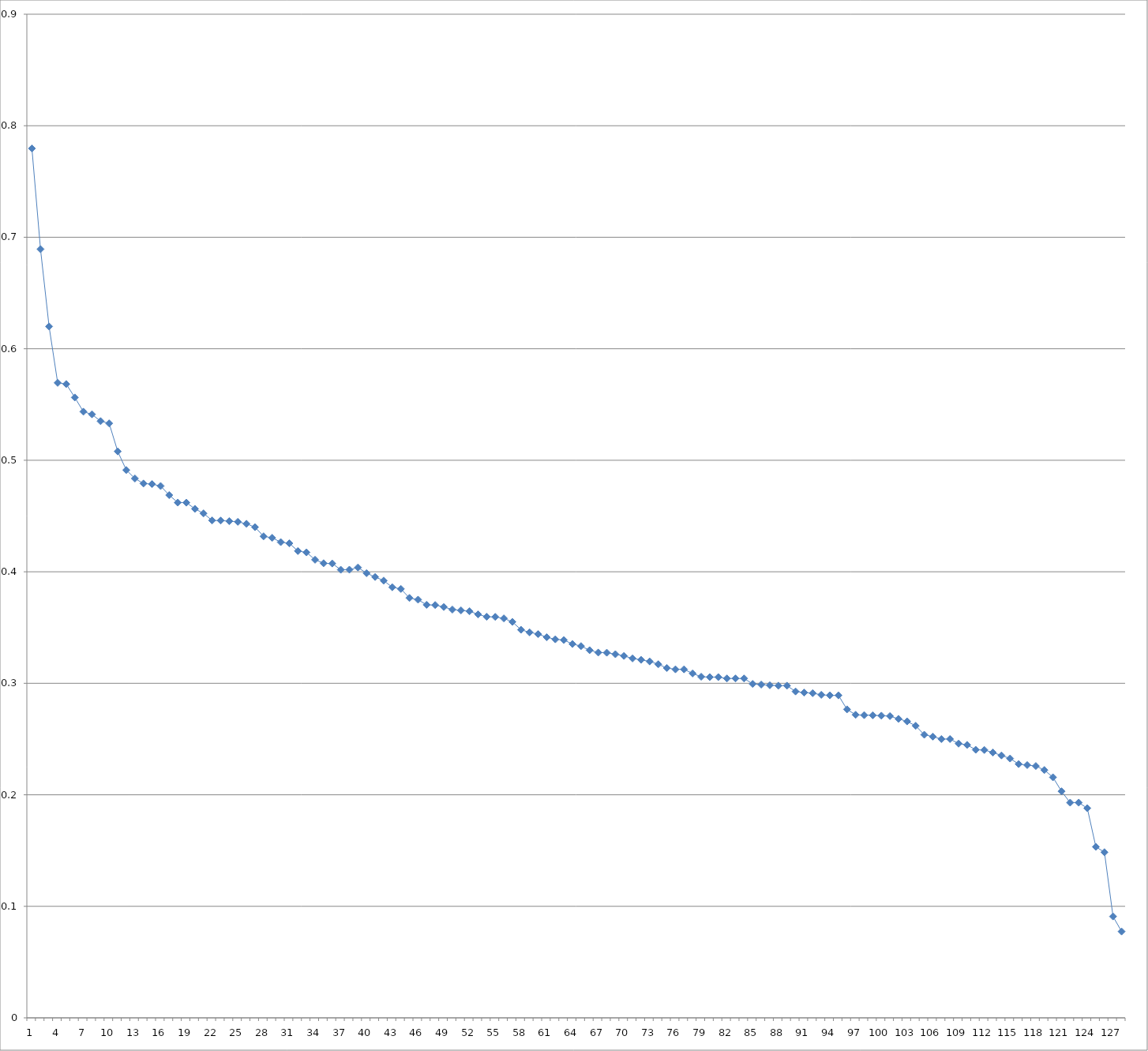
| Category | Series 0 |
|---|---|
| 0 | 0.78 |
| 1 | 0.689 |
| 2 | 0.62 |
| 3 | 0.569 |
| 4 | 0.568 |
| 5 | 0.556 |
| 6 | 0.544 |
| 7 | 0.541 |
| 8 | 0.535 |
| 9 | 0.533 |
| 10 | 0.508 |
| 11 | 0.491 |
| 12 | 0.484 |
| 13 | 0.479 |
| 14 | 0.479 |
| 15 | 0.477 |
| 16 | 0.469 |
| 17 | 0.462 |
| 18 | 0.462 |
| 19 | 0.456 |
| 20 | 0.452 |
| 21 | 0.446 |
| 22 | 0.446 |
| 23 | 0.445 |
| 24 | 0.445 |
| 25 | 0.443 |
| 26 | 0.44 |
| 27 | 0.432 |
| 28 | 0.43 |
| 29 | 0.427 |
| 30 | 0.426 |
| 31 | 0.419 |
| 32 | 0.417 |
| 33 | 0.411 |
| 34 | 0.408 |
| 35 | 0.407 |
| 36 | 0.402 |
| 37 | 0.402 |
| 38 | 0.404 |
| 39 | 0.399 |
| 40 | 0.395 |
| 41 | 0.392 |
| 42 | 0.386 |
| 43 | 0.385 |
| 44 | 0.377 |
| 45 | 0.375 |
| 46 | 0.37 |
| 47 | 0.37 |
| 48 | 0.368 |
| 49 | 0.366 |
| 50 | 0.365 |
| 51 | 0.365 |
| 52 | 0.362 |
| 53 | 0.36 |
| 54 | 0.36 |
| 55 | 0.358 |
| 56 | 0.355 |
| 57 | 0.348 |
| 58 | 0.346 |
| 59 | 0.344 |
| 60 | 0.341 |
| 61 | 0.339 |
| 62 | 0.339 |
| 63 | 0.335 |
| 64 | 0.333 |
| 65 | 0.33 |
| 66 | 0.328 |
| 67 | 0.327 |
| 68 | 0.326 |
| 69 | 0.325 |
| 70 | 0.322 |
| 71 | 0.321 |
| 72 | 0.32 |
| 73 | 0.317 |
| 74 | 0.314 |
| 75 | 0.312 |
| 76 | 0.312 |
| 77 | 0.309 |
| 78 | 0.306 |
| 79 | 0.306 |
| 80 | 0.306 |
| 81 | 0.304 |
| 82 | 0.304 |
| 83 | 0.304 |
| 84 | 0.299 |
| 85 | 0.299 |
| 86 | 0.298 |
| 87 | 0.298 |
| 88 | 0.298 |
| 89 | 0.293 |
| 90 | 0.292 |
| 91 | 0.291 |
| 92 | 0.29 |
| 93 | 0.289 |
| 94 | 0.289 |
| 95 | 0.277 |
| 96 | 0.272 |
| 97 | 0.271 |
| 98 | 0.271 |
| 99 | 0.271 |
| 100 | 0.271 |
| 101 | 0.268 |
| 102 | 0.266 |
| 103 | 0.262 |
| 104 | 0.254 |
| 105 | 0.252 |
| 106 | 0.25 |
| 107 | 0.25 |
| 108 | 0.246 |
| 109 | 0.245 |
| 110 | 0.24 |
| 111 | 0.24 |
| 112 | 0.238 |
| 113 | 0.235 |
| 114 | 0.233 |
| 115 | 0.228 |
| 116 | 0.227 |
| 117 | 0.226 |
| 118 | 0.222 |
| 119 | 0.216 |
| 120 | 0.203 |
| 121 | 0.193 |
| 122 | 0.193 |
| 123 | 0.188 |
| 124 | 0.153 |
| 125 | 0.149 |
| 126 | 0.091 |
| 127 | 0.077 |